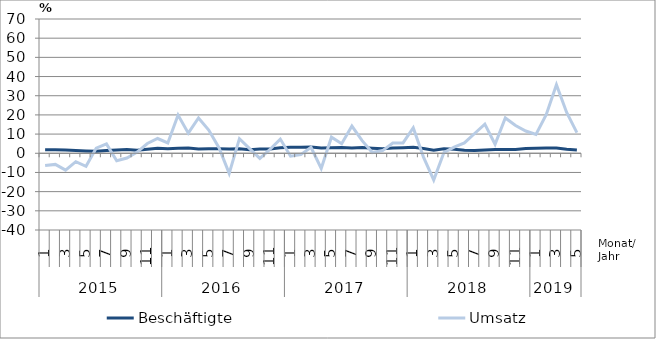
| Category | Beschäftigte | Umsatz |
|---|---|---|
| 0 | 1.8 | -6.4 |
| 1 | 1.8 | -5.8 |
| 2 | 1.7 | -8.8 |
| 3 | 1.5 | -4.4 |
| 4 | 1.2 | -6.8 |
| 5 | 1 | 2.7 |
| 6 | 1.4 | 4.9 |
| 7 | 1.7 | -3.9 |
| 8 | 2 | -2.5 |
| 9 | 1.6 | 0.6 |
| 10 | 2.1 | 5.1 |
| 11 | 2.6 | 7.7 |
| 12 | 2.4 | 5.4 |
| 13 | 2.6 | 19.9 |
| 14 | 2.7 | 10.5 |
| 15 | 2.2 | 18.4 |
| 16 | 2.3 | 12.1 |
| 17 | 2.3 | 2.9 |
| 18 | 2.2 | -10.5 |
| 19 | 2.4 | 7.6 |
| 20 | 1.8 | 2.4 |
| 21 | 2.2 | -2.7 |
| 22 | 2.2 | 2.1 |
| 23 | 2.9 | 7.4 |
| 24 | 3.2 | -1.5 |
| 25 | 3.2 | -0.7 |
| 26 | 3.3 | 3.1 |
| 27 | 2.7 | -7.9 |
| 28 | 2.9 | 8.4 |
| 29 | 3 | 5 |
| 30 | 2.8 | 14.2 |
| 31 | 3 | 6.6 |
| 32 | 2.6 | 0.4 |
| 33 | 2.3 | 1.4 |
| 34 | 2.7 | 5.3 |
| 35 | 2.9 | 5.4 |
| 36 | 3.1 | 13.3 |
| 37 | 2.5 | -2 |
| 38 | 1.6 | -13.9 |
| 39 | 2.4 | 0.4 |
| 40 | 2.1 | 3.2 |
| 41 | 1.6 | 5.4 |
| 42 | 1.5 | 10.3 |
| 43 | 1.7 | 15.2 |
| 44 | 2 | 4.7 |
| 45 | 2 | 18.4 |
| 46 | 2 | 14.5 |
| 47 | 2.5 | 11.6 |
| 48 | 2.6 | 9.8 |
| 49 | 2.8 | 20.1 |
| 50 | 2.8 | 35.7 |
| 51 | 2.1 | 21.3 |
| 52 | 1.7 | 10.8 |